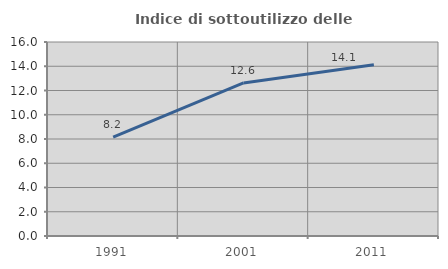
| Category | Indice di sottoutilizzo delle abitazioni  |
|---|---|
| 1991.0 | 8.157 |
| 2001.0 | 12.621 |
| 2011.0 | 14.127 |